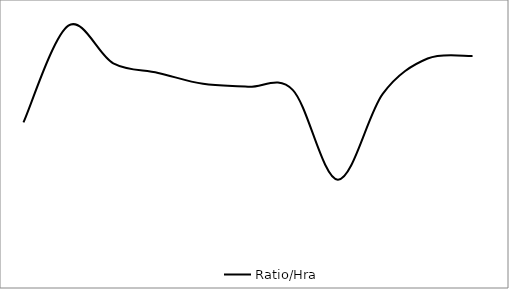
| Category | Ratio/Hra |
|---|---|
| 43 | 446.39 |
| 44 | 732.919 |
| 45 | 621.285 |
| 46 | 592.84 |
| 47 | 560.424 |
| 48 | 551.739 |
| 49 | 542.009 |
| 50 | 276.588 |
| 51 | 530.698 |
| 52 | 635.437 |
| 53 | 642.8 |